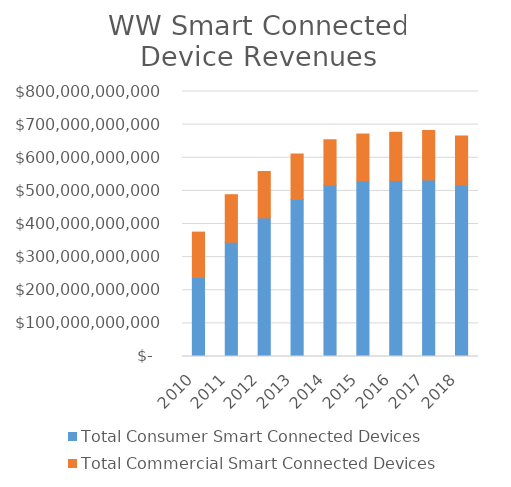
| Category | Total Consumer Smart Connected Devices | Total Commercial Smart Connected Devices |
|---|---|---|
| 2010.0 | 238459742486.58 | 137056064231.46 |
| 2011.0 | 344982737780.61 | 143365767861 |
| 2012.0 | 418374117826.04 | 140200542633.98 |
| 2013.0 | 474005624021.71 | 137263152370.01 |
| 2014.0 | 516844947488.54 | 137410694998.38 |
| 2015.0 | 530815806934.28 | 140811552069.36 |
| 2016.0 | 531558744781.97 | 145388779608.11 |
| 2017.0 | 533015968921.47 | 149186257913.79 |
| 2018.0 | 517407170802.51 | 148292270526.25 |